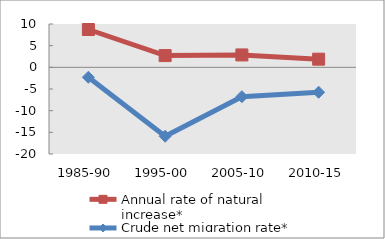
| Category | Annual rate of natural increase* | Crude net migration rate* |
|---|---|---|
| 1985-90 | 8.729 | -2.292 |
| 1995-00 | 2.71 | -15.902 |
| 2005-10 | 2.86 | -6.769 |
| 2010-15 | 1.881 | -5.752 |